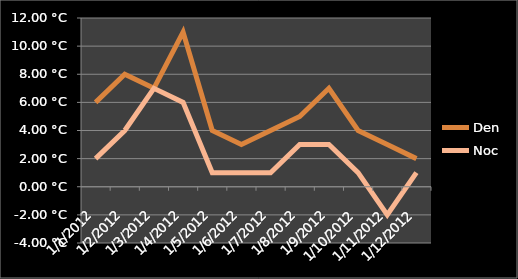
| Category | Den | Noc |
|---|---|---|
| 2012-01-01 | 6 | 2 |
| 2012-01-02 | 8 | 4 |
| 2012-01-03 | 7 | 7 |
| 2012-01-04 | 11 | 6 |
| 2012-01-05 | 4 | 1 |
| 2012-01-06 | 3 | 1 |
| 2012-01-07 | 4 | 1 |
| 2012-01-08 | 5 | 3 |
| 2012-01-09 | 7 | 3 |
| 2012-01-10 | 4 | 1 |
| 2012-01-11 | 3 | -2 |
| 2012-01-12 | 2 | 1 |